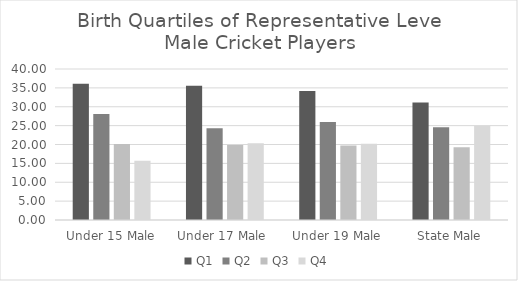
| Category | Q1 | Q2 | Q3 | Q4 |
|---|---|---|---|---|
| Under 15 Male | 36.095 | 28.107 | 20.118 | 15.68 |
| Under 17 Male  | 35.541 | 24.283 | 19.868 | 20.309 |
| Under 19 Male | 34.146 | 25.942 | 19.734 | 20.177 |
| State Male | 31.148 | 24.59 | 19.262 | 25 |